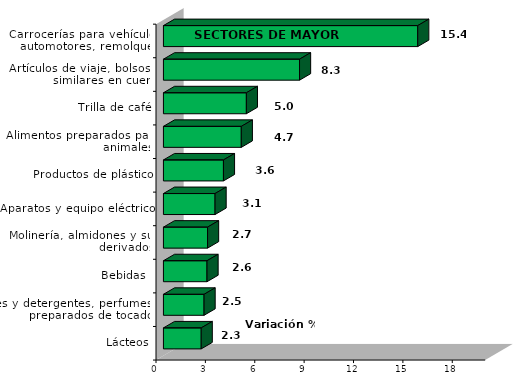
| Category | Series 0 |
|---|---|
| Carrocerías para vehículos automotores, remolques | 15.449 |
| Artículos de viaje, bolsos y similares en cuero | 8.269 |
| Trilla de café | 5.038 |
| Alimentos preparados para animales | 4.73 |
| Productos de plástico | 3.646 |
| Aparatos y equipo eléctrico | 3.136 |
| Molinería, almidones y sus derivados | 2.68 |
| Bebidas  | 2.647 |
| Jabones y detergentes, perfumes y preparados de tocador | 2.467 |
| Lácteos | 2.295 |